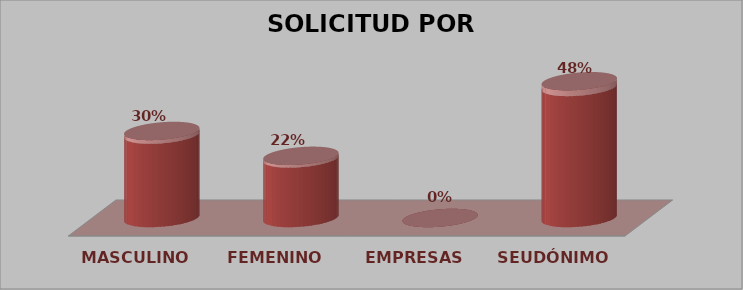
| Category | SOLICITUD POR GÉNERO | Series 1 |
|---|---|---|
| MASCULINO | 7 | 0.304 |
| FEMENINO | 5 | 0.217 |
| EMPRESAS | 0 | 0 |
| SEUDÓNIMO | 11 | 0.478 |